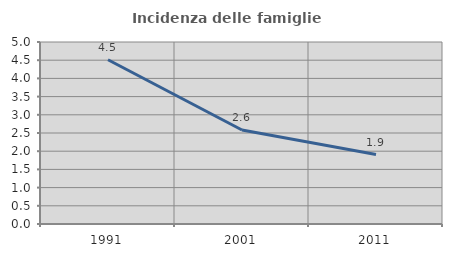
| Category | Incidenza delle famiglie numerose |
|---|---|
| 1991.0 | 4.513 |
| 2001.0 | 2.582 |
| 2011.0 | 1.907 |